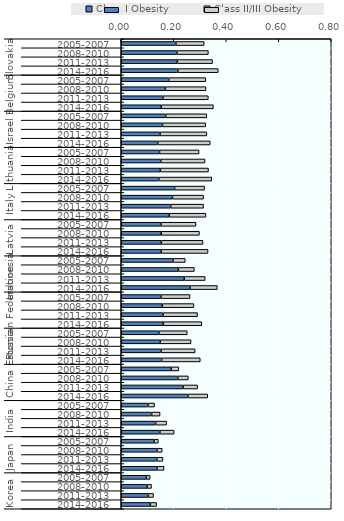
| Category | Class I Obesity | Class II/III Obesity |
|---|---|---|
| 0 | 0.208 | 0.108 |
| 1 | 0.212 | 0.12 |
| 2 | 0.214 | 0.134 |
| 3 | 0.216 | 0.154 |
| 4 | 0.181 | 0.141 |
| 5 | 0.168 | 0.155 |
| 6 | 0.159 | 0.173 |
| 7 | 0.153 | 0.198 |
| 8 | 0.17 | 0.156 |
| 9 | 0.157 | 0.164 |
| 10 | 0.148 | 0.178 |
| 11 | 0.139 | 0.2 |
| 12 | 0.146 | 0.15 |
| 13 | 0.151 | 0.168 |
| 14 | 0.149 | 0.183 |
| 15 | 0.143 | 0.202 |
| 16 | 0.203 | 0.114 |
| 17 | 0.195 | 0.118 |
| 18 | 0.188 | 0.125 |
| 19 | 0.183 | 0.139 |
| 20 | 0.152 | 0.133 |
| 21 | 0.152 | 0.145 |
| 22 | 0.153 | 0.159 |
| 23 | 0.152 | 0.178 |
| 24 | 0.197 | 0.047 |
| 25 | 0.217 | 0.061 |
| 26 | 0.24 | 0.08 |
| 27 | 0.262 | 0.104 |
| 28 | 0.151 | 0.111 |
| 29 | 0.157 | 0.12 |
| 30 | 0.159 | 0.131 |
| 31 | 0.16 | 0.147 |
| 32 | 0.143 | 0.108 |
| 33 | 0.148 | 0.118 |
| 34 | 0.151 | 0.13 |
| 35 | 0.154 | 0.147 |
| 36 | 0.191 | 0.029 |
| 37 | 0.215 | 0.04 |
| 38 | 0.236 | 0.055 |
| 39 | 0.254 | 0.076 |
| 40 | 0.102 | 0.025 |
| 41 | 0.116 | 0.032 |
| 42 | 0.131 | 0.042 |
| 43 | 0.147 | 0.054 |
| 44 | 0.125 | 0.016 |
| 45 | 0.136 | 0.02 |
| 46 | 0.136 | 0.023 |
| 47 | 0.136 | 0.027 |
| 48 | 0.096 | 0.014 |
| 49 | 0.099 | 0.017 |
| 50 | 0.103 | 0.019 |
| 51 | 0.111 | 0.024 |